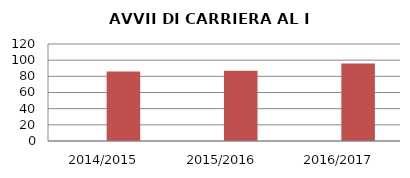
| Category | ANNO | NUMERO |
|---|---|---|
| 2014/2015 | 0 | 86 |
| 2015/2016 | 0 | 87 |
| 2016/2017 | 0 | 96 |